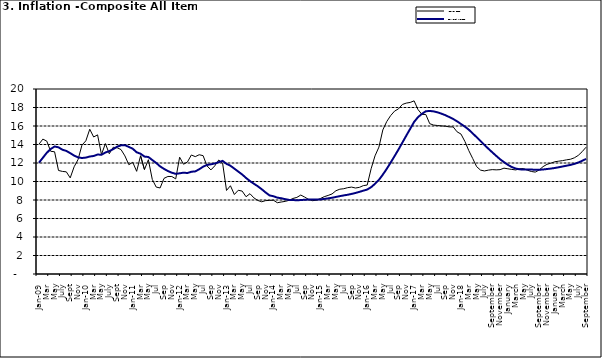
| Category | Year-on Rate | 12-Month Average |
|---|---|---|
| Jan-09 | 14.034 | 12.032 |
| Feb | 14.584 | 12.567 |
| Mar | 14.366 | 13.101 |
| Apr | 13.268 | 13.51 |
| May | 13.212 | 13.787 |
| June | 11.194 | 13.694 |
| July | 11.09 | 13.437 |
| Aug | 11.046 | 13.307 |
| Sept | 10.39 | 13.065 |
| Oct | 11.588 | 12.803 |
| Nov | 12.368 | 12.609 |
| Dec | 13.93 | 12.538 |
| Jan-10 | 14.398 | 12.586 |
| Feb | 15.649 | 12.7 |
| Mar | 14.812 | 12.757 |
| Apr | 15.044 | 12.915 |
| May | 12.915 | 12.893 |
| June | 14.099 | 13.132 |
| July | 13.002 | 13.284 |
| Aug | 13.702 | 13.5 |
| Sept | 13.65 | 13.764 |
| Oct | 13.45 | 13.908 |
| Nov | 12.766 | 13.928 |
| Dec | 11.815 | 13.74 |
| Jan-11 | 12.08 | 13.542 |
| Feb | 11.1 | 13.161 |
| Mar | 12.779 | 13.001 |
| Apr | 11.291 | 12.694 |
| May | 12.352 | 12.648 |
| Jun | 10.23 | 12.321 |
| Jul | 9.397 | 12.009 |
| Aug | 9.301 | 11.635 |
| Sep | 10.339 | 11.363 |
| Oct | 10.544 | 11.13 |
| Nov | 10.54 | 10.952 |
| Dec | 10.283 | 10.826 |
| Jan-12 | 12.626 | 10.886 |
| Feb | 11.866 | 10.955 |
| Mar | 12.111 | 10.914 |
| Apr | 12.866 | 11.054 |
| May | 12.688 | 11.096 |
| Jun | 12.892 | 11.32 |
| Jul | 12.797 | 11.599 |
| Aug | 11.689 | 11.791 |
| Sep | 11.253 | 11.859 |
| Oct | 11.693 | 11.948 |
| Nov | 12.32 | 12.091 |
| Dec | 11.981 | 12.224 |
| Jan-13 | 9.031 | 11.908 |
| Feb | 9.542 | 11.703 |
| Mar | 8.593 | 11.394 |
| Apr | 9.052 | 11.072 |
| May | 8.964 | 10.761 |
| Jun | 8.353 | 10.383 |
| Jul | 8.682 | 10.047 |
| Aug | 8.231 | 9.761 |
| Sep | 7.952 | 9.486 |
| Oct | 7.807 | 9.167 |
| Nov | 7.931 | 8.815 |
| Dec | 7.957 | 8.496 |
| Jan-14 | 7.977 | 8.408 |
| Feb | 7.707 | 8.257 |
| Mar | 7.783 | 8.19 |
| Apr | 7.851 | 8.092 |
| May | 7.965 | 8.012 |
| Jun | 8.167 | 7.998 |
| Jul | 8.281 | 7.968 |
| Aug | 8.534 | 7.996 |
| Sep | 8.317 | 8.027 |
| Oct | 8.06 | 8.047 |
| Nov | 7.927 | 8.046 |
| Dec | 7.978 | 8.047 |
| Jan-15 | 8.157 | 8.063 |
| Feb | 8.359 | 8.117 |
| Mar | 8.494 | 8.176 |
| Apr | 8.655 | 8.243 |
| May | 9.003 | 8.331 |
| Jun | 9.168 | 8.417 |
| Jul | 9.218 | 8.497 |
| Aug | 9.336 | 8.566 |
| Sep | 9.394 | 8.658 |
| Oct | 9.296 | 8.76 |
| Nov | 9.368 | 8.879 |
| Dec | 9.554 | 9.009 |
| Jan-16 | 9.617 | 9.13 |
| Feb | 11.379 | 9.386 |
| Mar | 12.775 | 9.751 |
| Apr | 13.721 | 10.182 |
| May | 15.577 | 10.746 |
| Jun | 16.48 | 11.372 |
| Jul | 17.127 | 12.045 |
| Aug | 17.609 | 12.744 |
| Sep | 17.852 | 13.454 |
| Oct | 18.33 | 14.206 |
| Nov | 18.476 | 14.958 |
| Dec | 18.547 | 15.697 |
| Jan-17 | 18.719 | 16.441 |
| Feb | 17.78 | 16.958 |
| Mar | 17.256 | 17.315 |
| Apr | 17.244 | 17.591 |
| May | 16.251 | 17.628 |
| Jun | 16.098 | 17.578 |
| Jul | 16.053 | 17.475 |
| Aug | 16.012 | 17.331 |
| Sep | 15.979 | 17.17 |
| Oct | 15.905 | 16.968 |
| Nov | 15.901 | 16.76 |
| Dec | 15.372 | 16.502 |
| Jan-18 | 15.127 | 16.215 |
| Feb | 14.33 | 15.93 |
| Mar | 13.337 | 15.599 |
| Apr | 12.482 | 15.196 |
| May | 11.608 | 14.793 |
| June | 11.231 | 14.371 |
| July | 11.142 | 13.95 |
| August | 11.227 | 13.546 |
| September | 11.284 | 13.157 |
| October | 11.259 | 12.777 |
| November | 11.281 | 12.406 |
| December | 11.442 | 12.095 |
| January | 11.374 | 11.801 |
| February | 11.306 | 11.564 |
| March | 11.251 | 11.401 |
| April | 11.372 | 11.314 |
| May | 11.396 | 11.299 |
| June | 11.217 | 11.297 |
| July | 11.084 | 11.291 |
| August | 11.016 | 11.271 |
| September | 11.244 | 11.268 |
| October | 11.607 | 11.298 |
| November | 11.854 | 11.348 |
| December | 11.982 | 11.396 |
| January | 12.132 | 11.462 |
| February | 12.199 | 11.539 |
| March | 12.257 | 11.624 |
| April | 12.341 | 11.706 |
| May | 12.404 | 11.791 |
| June | 12.559 | 11.904 |
| July | 12.821 | 12.049 |
| August | 13.22 | 12.233 |
| September | 13.707 | 12.44 |